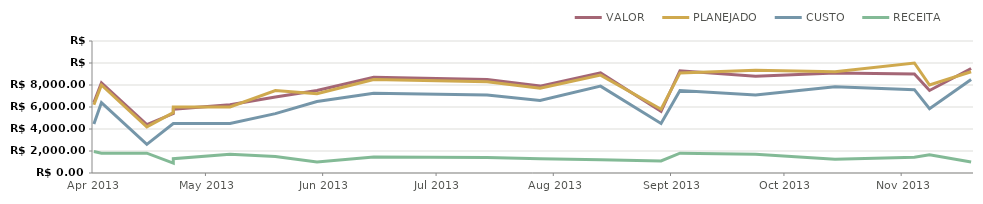
| Category | VALOR | PLANEJADO | CUSTO | RECEITA |
|---|---|---|---|---|
| 2013-04-23 | 6400 | 6200 | 4450 | 1950 |
| 2013-04-25 | 8200 | 8000 | 6400 | 1800 |
| 2013-05-07 | 4400 | 4200 | 2600 | 1800 |
| 2013-05-14 | 5400 | 5500 | 4500 | 900 |
| 2013-05-14 | 5800 | 6000 | 4500 | 1300 |
| 2013-05-29 | 6200 | 6000 | 4500 | 1700 |
| 2013-06-10 | 6900 | 7500 | 5400 | 1500 |
| 2013-06-21 | 7500 | 7200 | 6500 | 1000 |
| 2013-07-06 | 8700 | 8500 | 7250 | 1450 |
| 2013-08-05 | 8500 | 8300 | 7100 | 1400 |
| 2013-08-19 | 7900 | 7700 | 6600 | 1300 |
| 2013-09-04 | 9100 | 8900 | 7900 | 1200 |
| 2013-09-20 | 5600 | 5800 | 4500 | 1100 |
| 2013-09-25 | 9300 | 9100 | 7500 | 1800 |
| 2013-10-15 | 8800 | 9350 | 7100 | 1700 |
| 2013-11-05 | 9100 | 9200 | 7850 | 1250 |
| 2013-11-26 | 9000 | 10000 | 7575 | 1425 |
| 2013-11-30 | 7500 | 8000 | 5850 | 1650 |
| 2013-12-11 | 9500 | 9200 | 8500 | 1000 |